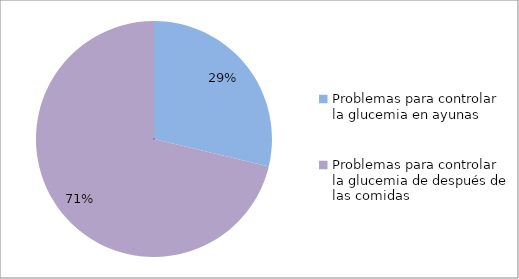
| Category | Series 0 | Series 1 | Series 2 |
|---|---|---|---|
| Problemas para controlar la glucemia en ayunas |  |  | 98 |
| Problemas para controlar la glucemia de después de las comidas |  |  | 243 |